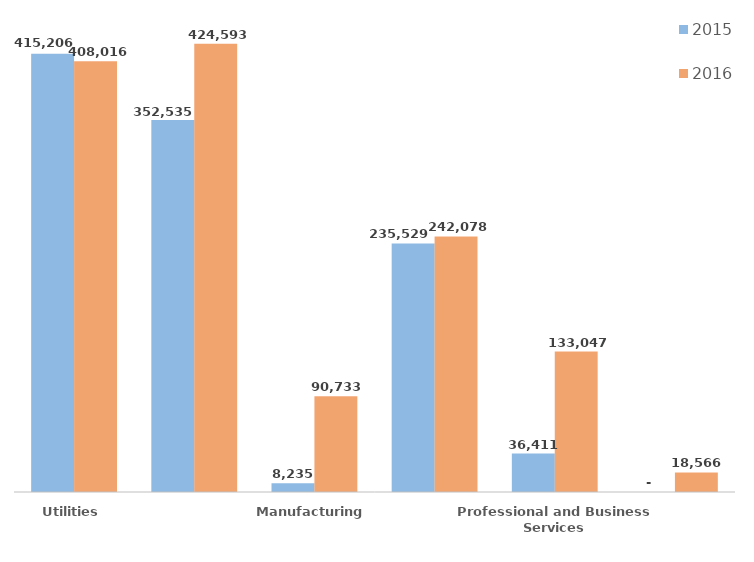
| Category | 2015 | 2016 |
|---|---|---|
| Utilities | 415206 | 408016 |
| Construction | 352535 | 424592.931 |
| Manufacturing | 8235.063 | 90732.928 |
| Wholesale Trade, Distribution, and Transport | 235529 | 242078 |
| Professional and Business Services | 36411.316 | 133046.586 |
| Other | 0 | 18565.679 |